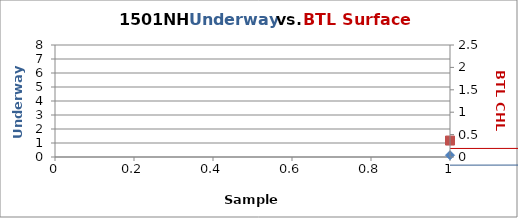
| Category |  FL |
|---|---|
| 0 | 0.128 |
| 1 | 0.159 |
| 2 | 0.284 |
| 3 | 0.041 |
| 4 | 0.078 |
| 5 | 0.093 |
| 6 | 0.056 |
| 7 | 0.037 |
| 8 | 0.07 |
| 9 | 0.093 |
| 10 | 0.101 |
| 11 | 0.073 |
| 12 | 0.084 |
| 13 | 0.079 |
| 14 | 0.102 |
| 15 | 0.326 |
| 16 | 0.155 |
| 17 | 0.103 |
| 18 | 0.14 |
| 19 | 0.757 |
| 20 | 1.048 |
| 21 | 0.781 |
| 22 | 1.376 |
| 23 | 0.181 |
| 24 | 0.161 |
| 25 | 0.074 |
| 26 | 0.148 |
| 27 | 0.601 |
| 28 | 0.115 |
| 29 | 0.114 |
| 30 | 0.053 |
| 31 | 0.041 |
| 32 | 0.114 |
| 33 | 0.084 |
| 34 | 0.066 |
| 35 | 0.063 |
| 36 | 0.089 |
| 37 | 0.139 |
| 38 | 0.105 |
| 39 | 0.166 |
| 40 | 0.184 |
| 41 | 0.117 |
| 42 | 0.374 |
| 43 | 1 |
| 44 | 0.702 |
| 45 | 0.445 |
| 46 | 1.304 |
| 47 | 0.386 |
| 48 | 1.016 |
| 49 | 0.405 |
| 50 | 0.347 |
| 51 | 0.112 |
| 52 | 0.14 |
| 53 | 0.083 |
| 54 | 0.138 |
| 55 | 0.19 |
| 56 | 0.164 |
| 57 | 0.195 |
| 58 | 0.387 |
| 59 | 0.358 |
| 60 | 0.592 |
| 61 | 0.775 |
| 62 | 1.005 |
| 63 | 0.403 |
| 64 | 0.583 |
| 65 | 0.412 |
| 66 | 0.472 |
| 67 | 0.313 |
| 68 | 0.44 |
| 69 | 0.475 |
| 70 | 1.178 |
| 71 | 1.433 |
| 72 | 1.173 |
| 73 | 1.964 |
| 74 | 2.137 |
| 75 | 2.355 |
| 76 | 1.865 |
| 77 | 1.811 |
| 78 | 2.167 |
| 79 | 2.696 |
| 80 | 2.855 |
| 81 | 3.794 |
| 82 | 3.979 |
| 83 | 4.601 |
| 84 | 6.197 |
| 85 | 6.815 |